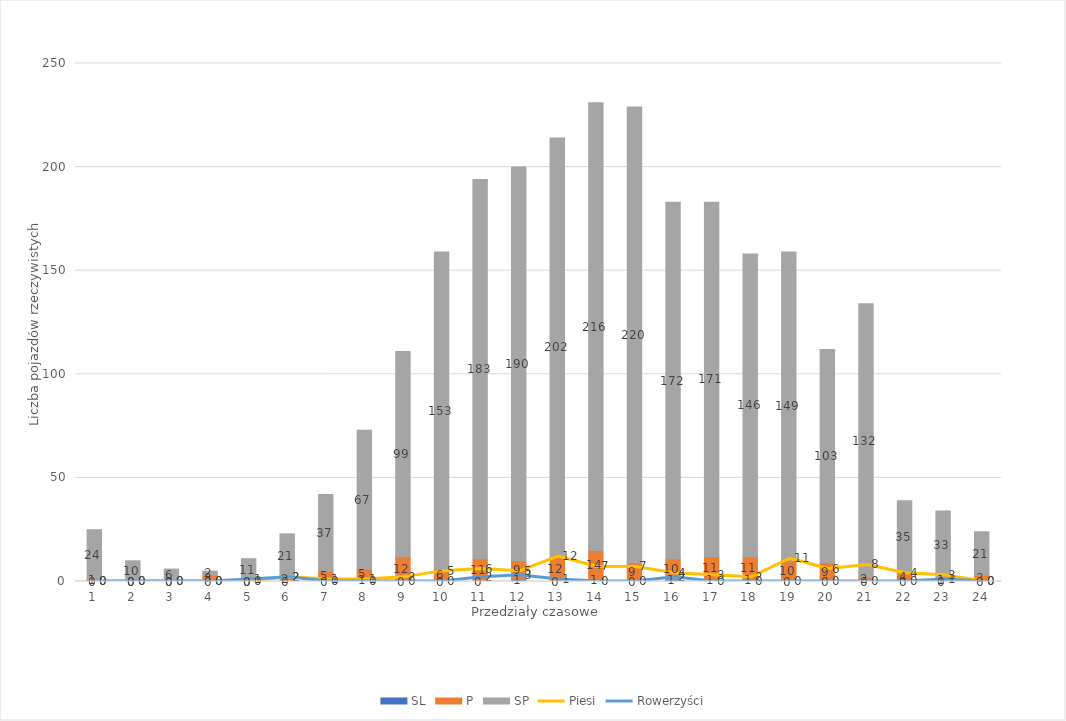
| Category | SL | P | SP |
|---|---|---|---|
| 0 | 0 | 1 | 24 |
| 1 | 0 | 0 | 10 |
| 2 | 0 | 0 | 6 |
| 3 | 0 | 3 | 2 |
| 4 | 0 | 0 | 11 |
| 5 | 0 | 2 | 21 |
| 6 | 0 | 5 | 37 |
| 7 | 1 | 5 | 67 |
| 8 | 0 | 12 | 99 |
| 9 | 0 | 6 | 153 |
| 10 | 0 | 11 | 183 |
| 11 | 1 | 9 | 190 |
| 12 | 0 | 12 | 202 |
| 13 | 1 | 14 | 216 |
| 14 | 0 | 9 | 220 |
| 15 | 1 | 10 | 172 |
| 16 | 1 | 11 | 171 |
| 17 | 1 | 11 | 146 |
| 18 | 0 | 10 | 149 |
| 19 | 0 | 9 | 103 |
| 20 | 0 | 2 | 132 |
| 21 | 0 | 4 | 35 |
| 22 | 0 | 1 | 33 |
| 23 | 0 | 3 | 21 |